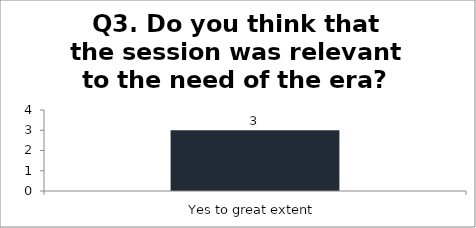
| Category | Q3. Do you think that the session was relevant to the need of the era? |
|---|---|
| Yes to great extent | 3 |